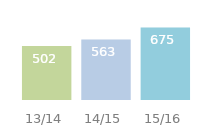
| Category | Series 0 |
|---|---|
| 13/14 | 502 |
| 14/15 | 563 |
| 15/16 | 675 |